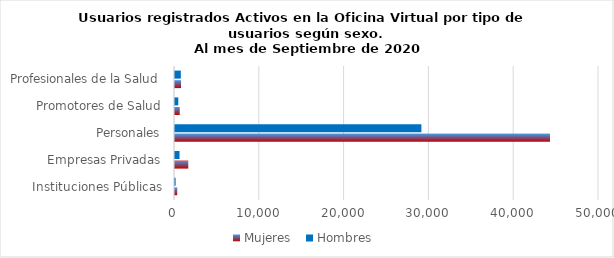
| Category | Mujeres | Hombres |
|---|---|---|
| Instituciones Públicas | 264 | 74 |
| Empresas Privadas | 1566 | 535 |
| Personales | 44222 | 29058 |
| Promotores de Salud | 561 | 386 |
| Profesionales de la Salud | 714 | 687 |